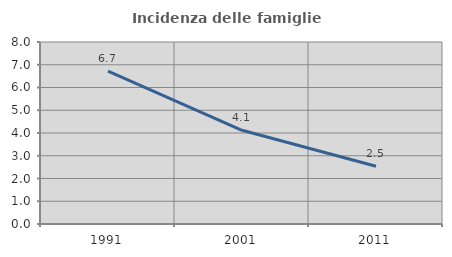
| Category | Incidenza delle famiglie numerose |
|---|---|
| 1991.0 | 6.724 |
| 2001.0 | 4.119 |
| 2011.0 | 2.536 |